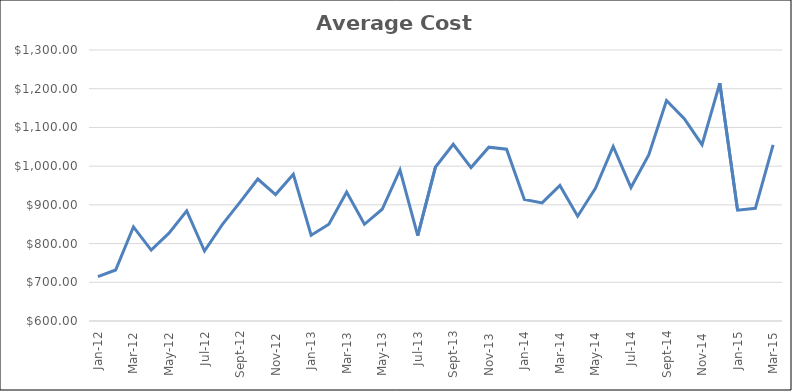
| Category | Average Cost PEPM |
|---|---|
| 2012-01-01 | 714.452 |
| 2012-02-01 | 731.801 |
| 2012-03-01 | 842.954 |
| 2012-04-01 | 783.23 |
| 2012-05-01 | 826.827 |
| 2012-06-01 | 884.583 |
| 2012-07-01 | 780.802 |
| 2012-08-01 | 849.087 |
| 2012-09-01 | 907.065 |
| 2012-10-01 | 966.758 |
| 2012-11-01 | 926.647 |
| 2012-12-01 | 979.051 |
| 2013-01-01 | 821.509 |
| 2013-02-01 | 850.086 |
| 2013-03-01 | 933.106 |
| 2013-04-01 | 849.817 |
| 2013-05-01 | 888.625 |
| 2013-06-01 | 990.478 |
| 2013-07-01 | 820.557 |
| 2013-08-01 | 997.897 |
| 2013-09-01 | 1056.364 |
| 2013-10-01 | 996.321 |
| 2013-11-01 | 1048.961 |
| 2013-12-01 | 1043.793 |
| 2014-01-01 | 913.705 |
| 2014-02-01 | 905.166 |
| 2014-03-01 | 950.313 |
| 2014-04-01 | 870.725 |
| 2014-05-01 | 942.514 |
| 2014-06-01 | 1050.735 |
| 2014-07-01 | 944.735 |
| 2014-08-01 | 1028.856 |
| 2014-09-01 | 1169.661 |
| 2014-10-01 | 1122.496 |
| 2014-11-01 | 1055.497 |
| 2014-12-01 | 1214.274 |
| 2015-01-01 | 886.164 |
| 2015-02-01 | 891.1 |
| 2015-03-01 | 1054.849 |